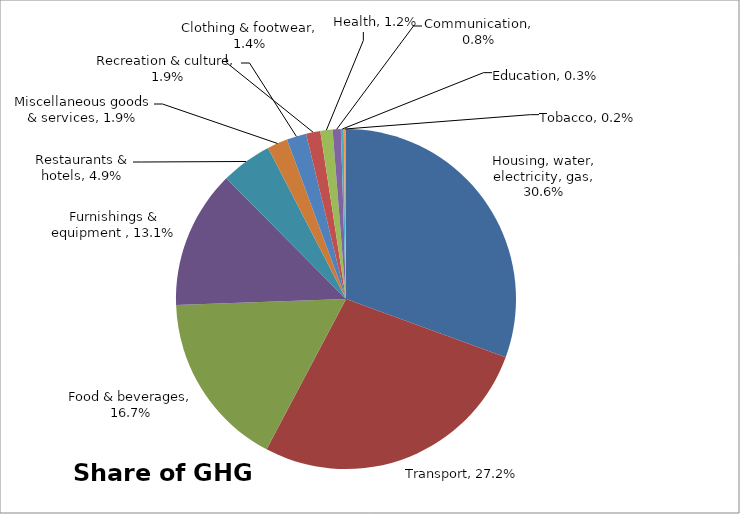
| Category | Share of GHG emissions  |
|---|---|
| Housing, water, electricity, gas | 0.306 |
| Transport | 0.272 |
| Food & beverages | 0.167 |
| Furnishings & equipment  | 0.131 |
| Restaurants & hotels | 0.049 |
| Miscellaneous goods & services | 0.019 |
| Recreation & culture | 0.019 |
| Clothing & footwear | 0.014 |
| Health | 0.012 |
| Communication | 0.008 |
| Education | 0.003 |
| Tobacco | 0.002 |